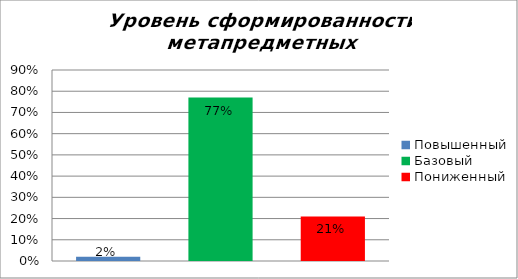
| Category | Уровень сформированности метапредметных результатов |
|---|---|
| Повышенный | 0.02 |
| Базовый | 0.77 |
| Пониженный | 0.21 |